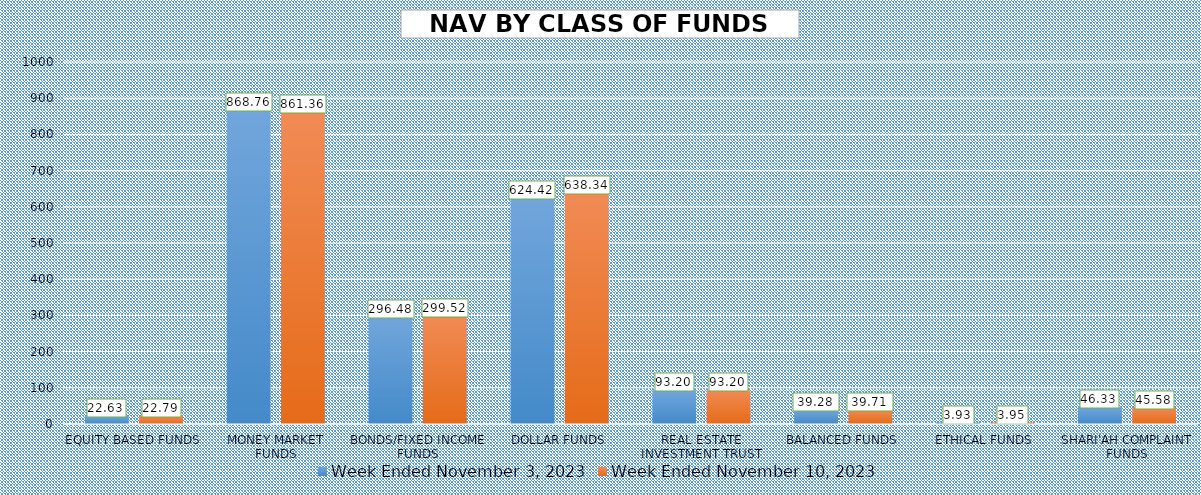
| Category | Week Ended November 3, 2023 | Week Ended November 10, 2023 |
|---|---|---|
| EQUITY BASED FUNDS | 22.628 | 22.794 |
| MONEY MARKET FUNDS | 868.764 | 861.363 |
| BONDS/FIXED INCOME FUNDS | 296.478 | 299.519 |
| DOLLAR FUNDS | 624.424 | 638.339 |
| REAL ESTATE INVESTMENT TRUST | 93.195 | 93.197 |
| BALANCED FUNDS | 39.28 | 39.711 |
| ETHICAL FUNDS | 3.928 | 3.955 |
| SHARI'AH COMPLAINT FUNDS | 46.332 | 45.577 |